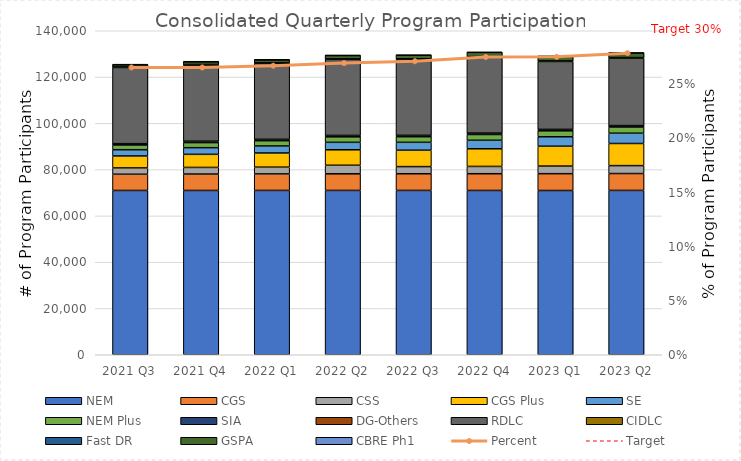
| Category | NEM | CGS | CSS | CGS Plus | SE | NEM Plus | SIA | DG-Others | RDLC | CIDLC | Fast DR | GSPA | CBRE Ph1 |
|---|---|---|---|---|---|---|---|---|---|---|---|---|---|
| 2021 Q3 | 70994 | 7000 | 2735 | 5175 | 2694 | 2038 | 530 | 47 | 32910 | 203 | 46 | 971 | 1 |
| 2021 Q4 | 70996 | 7092 | 2855 | 5661 | 2880 | 2183 | 579 | 47 | 32889 | 203 | 46 | 1199 | 1 |
| 2022 Q1 | 71007 | 7139 | 2926 | 6113 | 3035 | 2276 | 558 | 47 | 32850 | 203 | 46 | 1243 | 1 |
| 2022 Q2 | 71007 | 7177 | 3702 | 6683 | 3223 | 2375 | 560 | 47 | 32848 | 203 | 45 | 1468 | 1 |
| 2022 Q3 | 71008 | 7204 | 3088 | 7086 | 3412 | 2415 | 564 | 47 | 32820 | 203 | 44 | 1565 | 1 |
| 2022 Q4 | 70999 | 7222 | 3151 | 7632 | 3677 | 2483 | 572 | 47 | 32802 | 203 | 43 | 1846 | 1 |
| 2023 Q1 | 70977 | 7264 | 3284 | 8583 | 4083 | 2578 | 574 | 47 | 29343 | 203 | 43 | 1982 | 1 |
| 2023 Q2 | 71019 | 7280 | 3426 | 9568 | 4438 | 2679 | 576 | 47 | 29134 | 203 | 39 | 2007 | 1 |